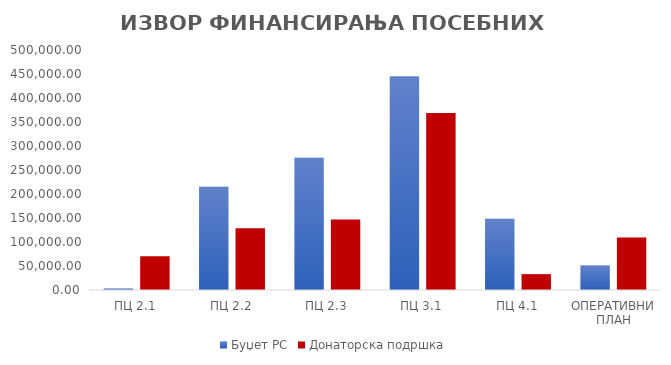
| Category | Буџет РС | Донаторска подршка |
|---|---|---|
| ПЦ 2.1 | 3330.25 | 70541.14 |
| ПЦ 2.2 | 215004 | 128582.1 |
| ПЦ 2.3 | 275441.312 | 146681.346 |
| ПЦ 3.1 | 445100.766 | 368994.95 |
| ПЦ 4.1 | 148684.76 | 33010.045 |
| ОПЕРАТИВНИ ПЛАН | 51395.17 | 109304.88 |